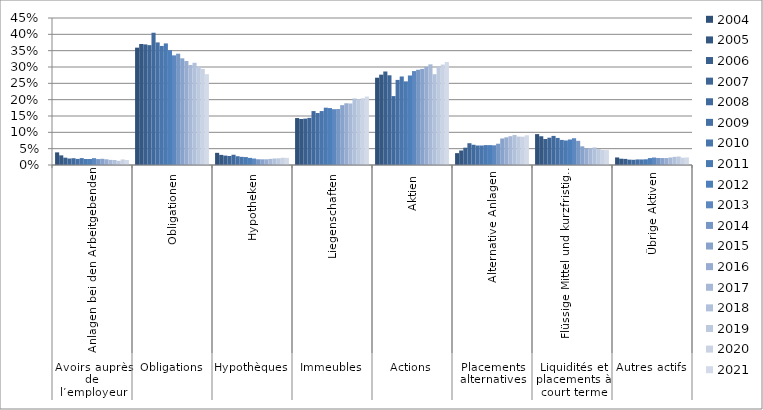
| Category | 2004 | 2005 | 2006 | 2007 | 2008 | 2009 | 2010 | 2011 | 2012 | 2013 | 2014 | 2015 | 2016 | 2017 | 2018 | 2019 | 2020 | 2021 |
|---|---|---|---|---|---|---|---|---|---|---|---|---|---|---|---|---|---|---|
| 0 | 0.039 | 0.03 | 0.022 | 0.02 | 0.021 | 0.019 | 0.021 | 0.018 | 0.018 | 0.021 | 0.018 | 0.019 | 0.017 | 0.016 | 0.015 | 0.013 | 0.017 | 0.015 |
| 1 | 0.359 | 0.37 | 0.369 | 0.367 | 0.405 | 0.375 | 0.364 | 0.372 | 0.351 | 0.336 | 0.341 | 0.327 | 0.318 | 0.306 | 0.313 | 0.303 | 0.294 | 0.278 |
| 2 | 0.037 | 0.031 | 0.029 | 0.028 | 0.031 | 0.027 | 0.025 | 0.024 | 0.022 | 0.02 | 0.018 | 0.017 | 0.017 | 0.019 | 0.02 | 0.02 | 0.022 | 0.022 |
| 3 | 0.144 | 0.141 | 0.142 | 0.144 | 0.165 | 0.159 | 0.165 | 0.175 | 0.174 | 0.171 | 0.171 | 0.183 | 0.189 | 0.188 | 0.204 | 0.202 | 0.204 | 0.209 |
| 4 | 0.267 | 0.277 | 0.286 | 0.275 | 0.211 | 0.26 | 0.271 | 0.256 | 0.274 | 0.288 | 0.291 | 0.294 | 0.301 | 0.308 | 0.278 | 0.301 | 0.308 | 0.315 |
| 5 | 0.036 | 0.044 | 0.053 | 0.067 | 0.062 | 0.06 | 0.06 | 0.061 | 0.061 | 0.06 | 0.065 | 0.081 | 0.085 | 0.088 | 0.092 | 0.087 | 0.087 | 0.091 |
| 6 | 0.095 | 0.088 | 0.08 | 0.084 | 0.089 | 0.083 | 0.077 | 0.075 | 0.078 | 0.082 | 0.074 | 0.057 | 0.051 | 0.052 | 0.054 | 0.049 | 0.046 | 0.046 |
| 7 | 0.023 | 0.019 | 0.019 | 0.016 | 0.016 | 0.017 | 0.017 | 0.017 | 0.021 | 0.023 | 0.022 | 0.021 | 0.021 | 0.023 | 0.025 | 0.026 | 0.022 | 0.023 |